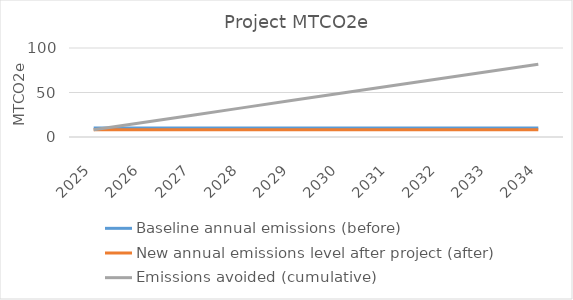
| Category | Baseline annual emissions (before) | New annual emissions level after project (after) | Emissions avoided (cumulative) |
|---|---|---|---|
| 2025.0 | 10.229 | 8.183 | 8.183 |
| 2026.0 | 10.229 | 8.183 | 16.366 |
| 2027.0 | 10.229 | 8.183 | 24.549 |
| 2028.0 | 10.229 | 8.183 | 32.731 |
| 2029.0 | 10.229 | 8.183 | 40.914 |
| 2030.0 | 10.229 | 8.183 | 49.097 |
| 2031.0 | 10.229 | 8.183 | 57.28 |
| 2032.0 | 10.229 | 8.183 | 65.463 |
| 2033.0 | 10.229 | 8.183 | 73.646 |
| 2034.0 | 10.229 | 8.183 | 81.829 |